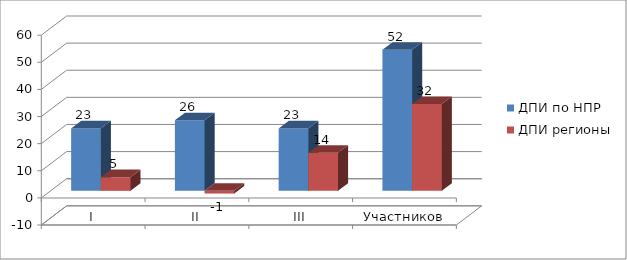
| Category | ДПИ по НПР | ДПИ регионы |
|---|---|---|
| I | 23 | 5 |
| II | 26 | -1 |
| III | 23 | 14 |
| Участников | 52 | 32 |